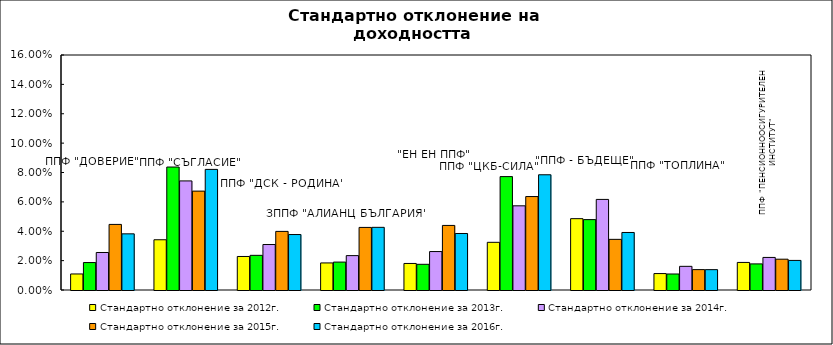
| Category | Стандартно отклонение за 2012г. | Стандартно отклонение за 2013г. | Стандартно отклонение за 2014г. | Стандартно отклонение за 2015г. | Стандартно отклонение за 2016г. |
|---|---|---|---|---|---|
| ППФ "ДОВЕРИЕ"  | 0.011 | 0.019 | 0.026 | 0.045 | 0.038 |
| ППФ "СЪГЛАСИЕ"  | 0.034 | 0.084 | 0.074 | 0.067 | 0.082 |
| ППФ "ДСК - РОДИНА" | 0.023 | 0.024 | 0.031 | 0.04 | 0.038 |
| ЗППФ "АЛИАНЦ БЪЛГАРИЯ" | 0.018 | 0.019 | 0.023 | 0.043 | 0.043 |
| "ЕН ЕН ППФ" | 0.018 | 0.017 | 0.026 | 0.044 | 0.038 |
| ППФ "ЦКБ-СИЛА" | 0.032 | 0.077 | 0.057 | 0.064 | 0.078 |
| "ППФ - БЪДЕЩЕ" | 0.049 | 0.048 | 0.062 | 0.034 | 0.039 |
| ППФ "ТОПЛИНА" | 0.011 | 0.011 | 0.016 | 0.014 | 0.014 |
| ППФ "ПЕНСИОННООСИГУРИТЕЛЕН ИНСТИТУТ" | 0.019 | 0.018 | 0.022 | 0.021 | 0.02 |